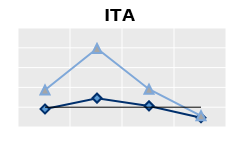
| Category | Public goods | Individual items only | Series 1 |
|---|---|---|---|
| 15-24 | 0.911 | 1.87 | 1 |
| 25-54 | 1.457 | 3.961 | 1 |
| 55-64 | 1.065 | 1.91 | 1 |
| 65+ | 0.47 | 0.566 | 1 |